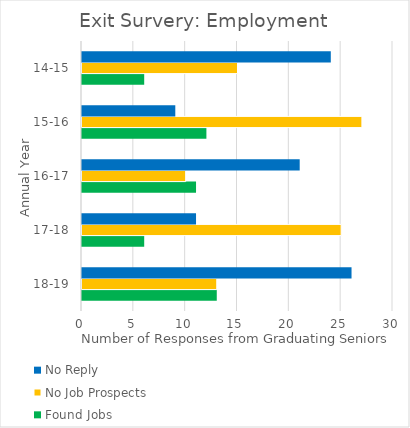
| Category | Found Jobs | No Job Prospects | No Reply |
|---|---|---|---|
| 18-19 | 13 | 13 | 26 |
| 17-18 | 6 | 25 | 11 |
| 16-17 | 11 | 10 | 21 |
| 15-16 | 12 | 27 | 9 |
| 14-15 | 6 | 15 | 24 |